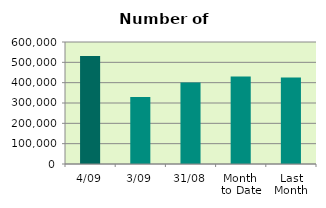
| Category | Series 0 |
|---|---|
| 4/09 | 531620 |
| 3/09 | 329488 |
| 31/08 | 400470 |
| Month 
to Date | 430554 |
| Last
Month | 425540 |